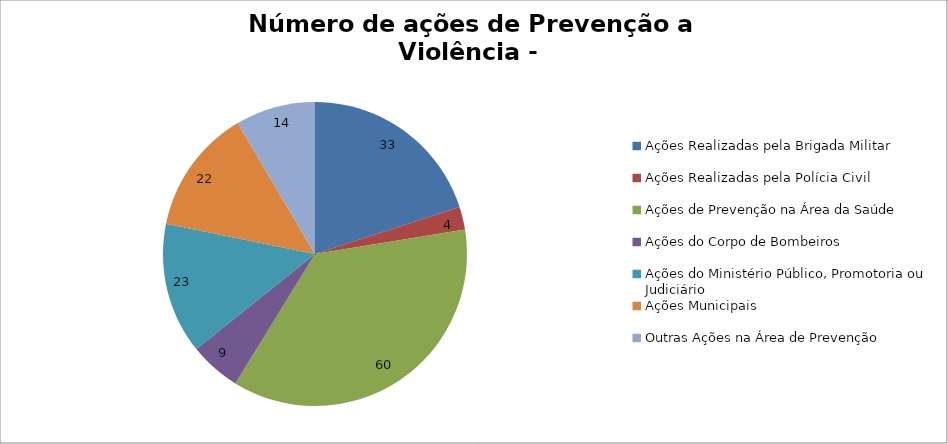
| Category | Número de Ações |
|---|---|
| Ações Realizadas pela Brigada Militar | 33 |
| Ações Realizadas pela Polícia Civil | 4 |
| Ações de Prevenção na Área da Saúde | 60 |
| Ações do Corpo de Bombeiros | 9 |
| Ações do Ministério Público, Promotoria ou Judiciário | 23 |
| Ações Municipais | 22 |
| Outras Ações na Área de Prevenção | 14 |